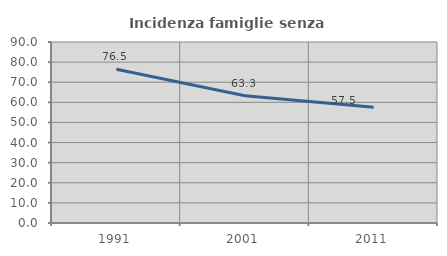
| Category | Incidenza famiglie senza nuclei |
|---|---|
| 1991.0 | 76.471 |
| 2001.0 | 63.265 |
| 2011.0 | 57.5 |